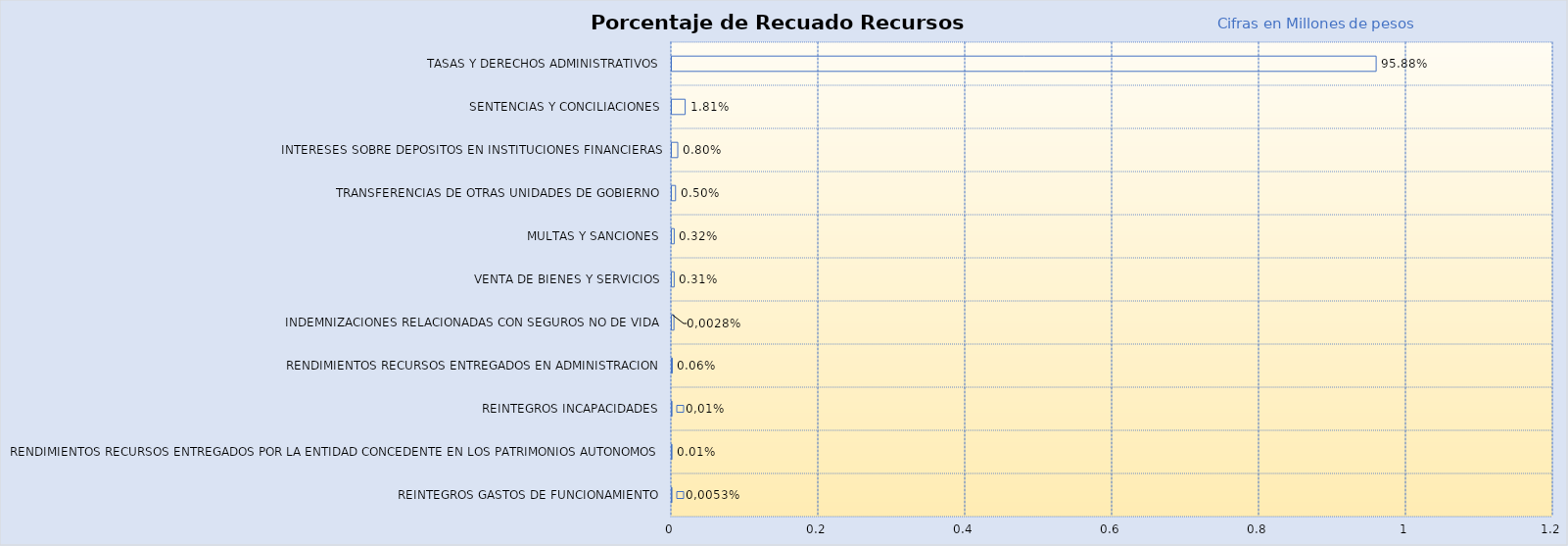
| Category | Total |
|---|---|
| REINTEGROS GASTOS DE FUNCIONAMIENTO | 0 |
| RENDIMIENTOS RECURSOS ENTREGADOS POR LA ENTIDAD CONCEDENTE EN LOS PATRIMONIOS AUTONOMOS | 0 |
| REINTEGROS INCAPACIDADES | 0 |
| RENDIMIENTOS RECURSOS ENTREGADOS EN ADMINISTRACION | 0.001 |
| INDEMNIZACIONES RELACIONADAS CON SEGUROS NO DE VIDA | 0.003 |
| VENTA DE BIENES Y SERVICIOS | 0.003 |
| MULTAS Y SANCIONES | 0.003 |
| TRANSFERENCIAS DE OTRAS UNIDADES DE GOBIERNO | 0.005 |
| INTERESES SOBRE DEPOSITOS EN INSTITUCIONES FINANCIERAS | 0.008 |
| SENTENCIAS Y CONCILIACIONES | 0.018 |
| TASAS Y DERECHOS ADMINISTRATIVOS | 0.959 |